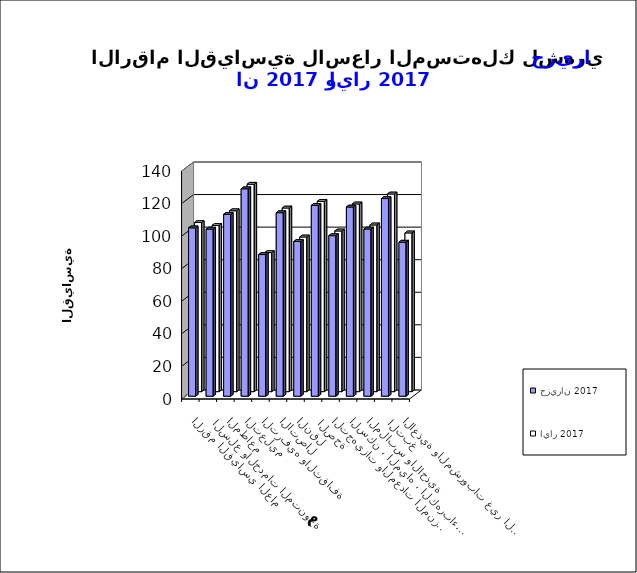
| Category | حزيران 2017      | ايار 2017       |
|---|---|---|
| الاغذية والمشروبات غير الكحولية | 94.6 | 97.5 |
|  التبغ | 121.4 | 121.4 |
| الملابس والاحذية | 102.7 | 102.4 |
| السكن ، المياه ، الكهرباء، الغاز  | 116.2 | 115.3 |
| التجهيزات والمعدات المنزلية والصيانة | 98.6 | 98.7 |
|  الصحة | 117.2 | 116.9 |
| النقل | 95 | 95 |
| الاتصال | 112.7 | 112.8 |
| الترفيه والثقافة | 87 | 85.4 |
| التعليم | 127.4 | 127.4 |
| المطاعم  | 111.7 | 111.1 |
|  السلع والخدمات المتنوعة | 102.6 | 102.1 |
| الرقم القياسي العام | 103.4 | 103.9 |